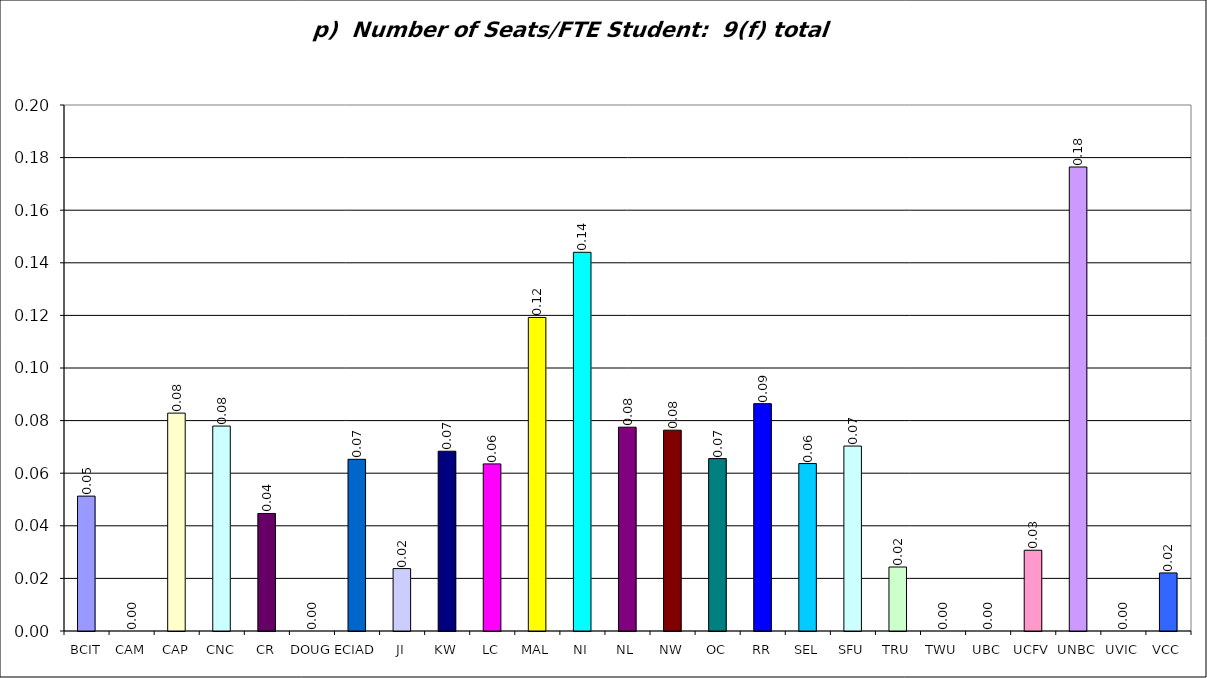
| Category | p)  Number of Seats/FTE Student:  9(f) total /3(a) |
|---|---|
| BCIT | 0.051 |
| CAM | 0 |
| CAP | 0.083 |
| CNC | 0.078 |
| CR | 0.045 |
| DOUG | 0 |
| ECIAD | 0.065 |
| JI | 0.024 |
| KW | 0.068 |
| LC | 0.064 |
| MAL | 0.119 |
| NI | 0.144 |
| NL | 0.078 |
| NW | 0.076 |
| OC | 0.066 |
| RR | 0.086 |
| SEL | 0.064 |
| SFU | 0.07 |
| TRU | 0.024 |
| TWU | 0 |
| UBC | 0 |
| UCFV | 0.031 |
| UNBC | 0.176 |
| UVIC | 0 |
| VCC | 0.022 |